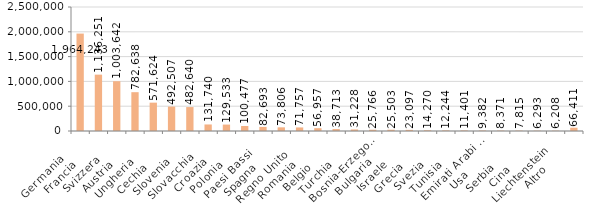
| Category | Series 0 |
|---|---|
| Germania        | 1964243 |
| Francia         | 1136251 |
| Svizzera        | 1003642 |
| Austria         | 782638 |
| Ungheria        | 571624 |
| Cechia          | 492507 |
| Slovenia        | 482640 |
| Slovacchia      | 131740 |
| Croazia         | 129533 |
| Polonia         | 100477 |
| Paesi Bassi     | 82693 |
| Spagna          | 73806 |
| Regno Unito     | 71757 |
| Romania         | 56957 |
| Belgio          | 38713 |
| Turchia         | 31228 |
| Bosnia-Erzegovina | 25766 |
| Bulgaria        | 25503 |
| Israele         | 23097 |
| Grecia          | 14270 |
| Svezia          | 12244 |
| Tunisia         | 11401 |
| Emirati Arabi Uniti | 9382 |
| Usa             | 8371 |
| Serbia          | 7815 |
| Cina            | 6293 |
| Liechtenstein   | 6208 |
| Altro           | 66411 |